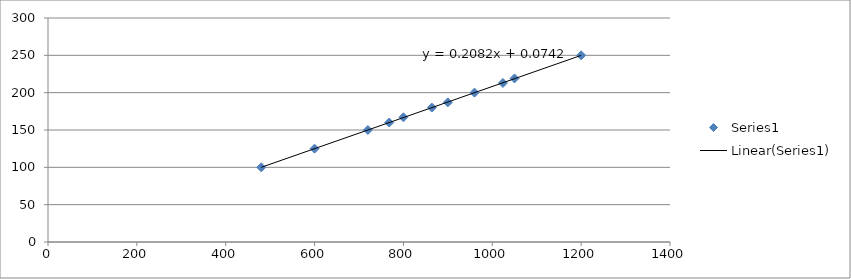
| Category | Series 0 |
|---|---|
| 480.0 | 100 |
| 600.0 | 125 |
| 720.0 | 150 |
| 768.0 | 160 |
| 800.0 | 167 |
| 864.0 | 180 |
| 900.0 | 187 |
| 960.0 | 200 |
| 1024.0 | 213 |
| 1050.0 | 219 |
| 1200.0 | 250 |